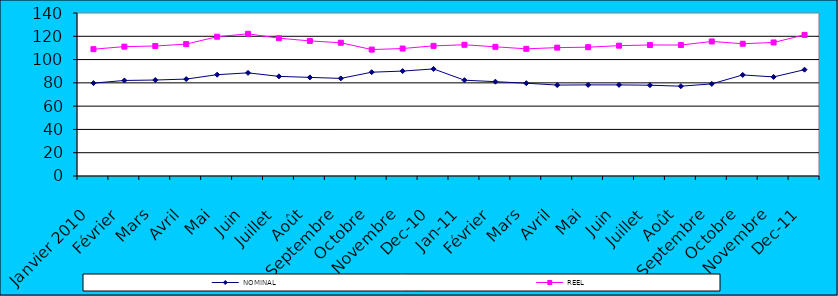
| Category | NOMINAL  | REEL  | Series 2 |
|---|---|---|---|
|  Janvier 2010 | 79.78 | 108.91 |  |
| Février | 82.06 | 111.11 |  |
| Mars | 82.43 | 111.65 |  |
| Avril | 83.24 | 113.28 |  |
| Mai | 87.02 | 119.64 |  |
| Juin | 88.59 | 122.12 |  |
| Juillet | 85.57 | 118.34 |  |
| Août | 84.69 | 116.02 |  |
| Septembre | 83.83 | 114.45 |  |
| Octobre | 89.16 | 108.59 |  |
| Novembre | 90.11 | 109.49 |  |
| déc-10 | 91.96 | 111.77 |  |
| janv-11 | 82.29 | 112.72 |  |
| Février | 81.02 | 110.97 |  |
| Mars | 79.702 | 109.233 |  |
| Avril | 78.1 | 110.25 |  |
| Mai | 78.26 | 110.63 |  |
| Juin | 78.25 | 111.95 |  |
| Juillet | 77.98 | 112.53 |  |
| Août | 77.15 | 112.48 |  |
| Septembre | 79.1 | 115.55 |  |
| Octobre | 86.8 | 113.6 |  |
| Novembre | 85.1 | 114.7 |  |
| déc-11 | 91.3 | 121.2 |  |